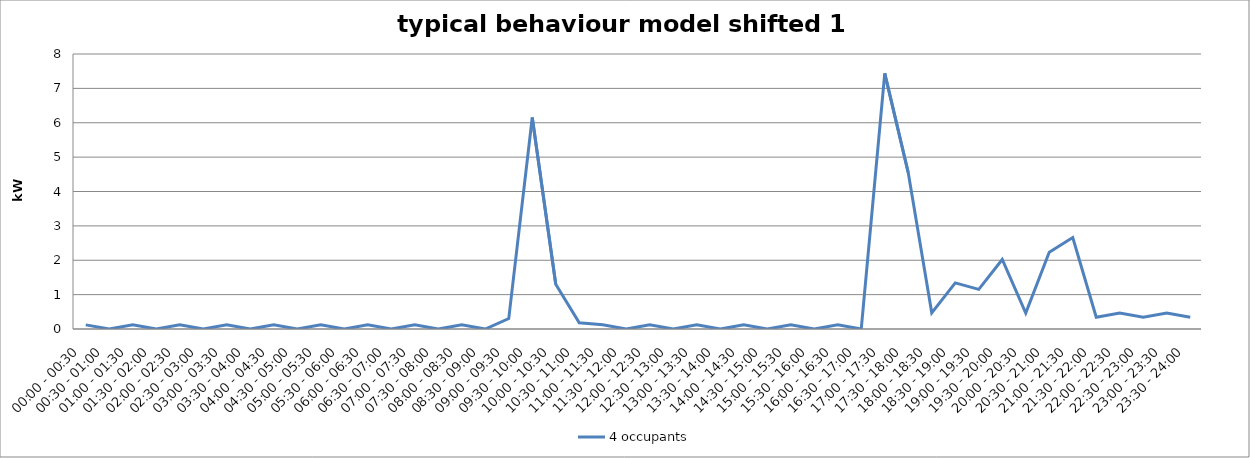
| Category | 4 occupants |
|---|---|
| 00:00 - 00:30 | 0.121 |
| 00:30 - 01:00 | 0 |
| 01:00 - 01:30 | 0.121 |
| 01:30 - 02:00 | 0 |
| 02:00 - 02:30 | 0.121 |
| 02:30 - 03:00 | 0 |
| 03:00 - 03:30 | 0.121 |
| 03:30 - 04:00 | 0 |
| 04:00 - 04:30 | 0.121 |
| 04:30 - 05:00 | 0 |
| 05:00 - 05:30 | 0.121 |
| 05:30 - 06:00 | 0 |
| 06:00 - 06:30 | 0.121 |
| 06:30 - 07:00 | 0 |
| 07:00 - 07:30 | 0.121 |
| 07:30 - 08:00 | 0 |
| 08:00 - 08:30 | 0.121 |
| 08:30 - 09:00 | 0 |
| 09:00 - 09:30 | 0.303 |
| 09:30 - 10:00 | 6.153 |
| 10:00 - 10:30 | 1.302 |
| 10:30 - 11:00 | 0.183 |
| 11:00 - 11:30 | 0.121 |
| 11:30 - 12:00 | 0 |
| 12:00 - 12:30 | 0.121 |
| 12:30 - 13:00 | 0 |
| 13:00 - 13:30 | 0.121 |
| 13:30 - 14:00 | 0 |
| 14:00 - 14:30 | 0.121 |
| 14:30 - 15:00 | 0 |
| 15:00 - 15:30 | 0.121 |
| 15:30 - 16:00 | 0 |
| 16:00 - 16:30 | 0.121 |
| 16:30 - 17:00 | 0 |
| 17:00 - 17:30 | 7.437 |
| 17:30 - 18:00 | 4.546 |
| 18:00 - 18:30 | 0.471 |
| 18:30 - 19:00 | 1.342 |
| 19:00 - 19:30 | 1.153 |
| 19:30 - 20:00 | 2.023 |
| 20:00 - 20:30 | 0.463 |
| 20:30 - 21:00 | 2.233 |
| 21:00 - 21:30 | 2.663 |
| 21:30 - 22:00 | 0.343 |
| 22:00 - 22:30 | 0.463 |
| 22:30 - 23:00 | 0.343 |
| 23:00 - 23:30 | 0.463 |
| 23:30 - 24:00 | 0.343 |